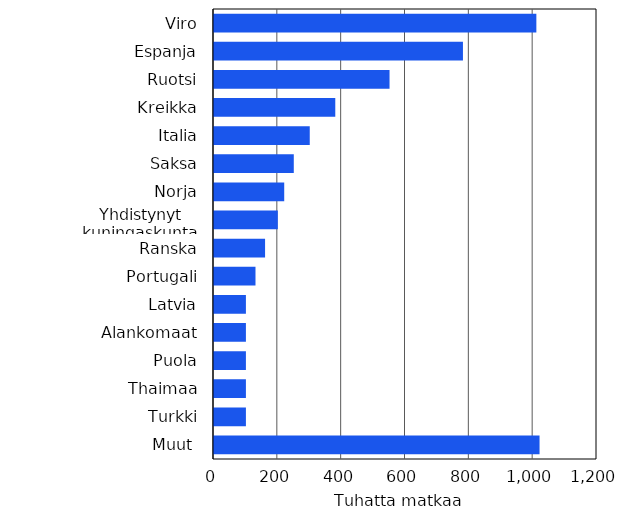
| Category | Tuhatta matkaa |
|---|---|
| Viro | 1010 |
| Espanja | 780 |
| Ruotsi | 550 |
| Kreikka | 380 |
| Italia | 300 |
| Saksa | 250 |
| Norja | 220 |
| Yhdistynyt kuningaskunta | 200 |
| Ranska | 160 |
| Portugali | 130 |
| Latvia | 100 |
| Alankomaat | 100 |
| Puola | 100 |
| Thaimaa | 100 |
| Turkki | 100 |
| Muut  | 1020 |